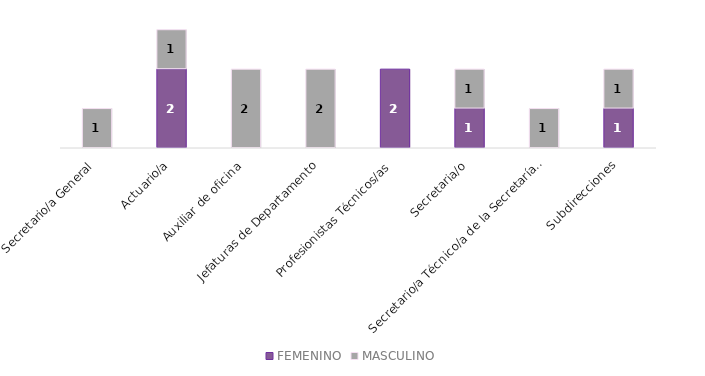
| Category | FEMENINO | MASCULINO |
|---|---|---|
| Secretario/a General | 0 | 1 |
| Actuario/a | 2 | 1 |
| Auxiliar de oficina | 0 | 2 |
| Jefaturas de Departamento | 0 | 2 |
| Profesionistas Técnicos/as | 2 | 0 |
| Secretaria/o | 1 | 1 |
| Secretario/a Técnico/a de la Secretaría General | 0 | 1 |
| Subdirecciones | 1 | 1 |